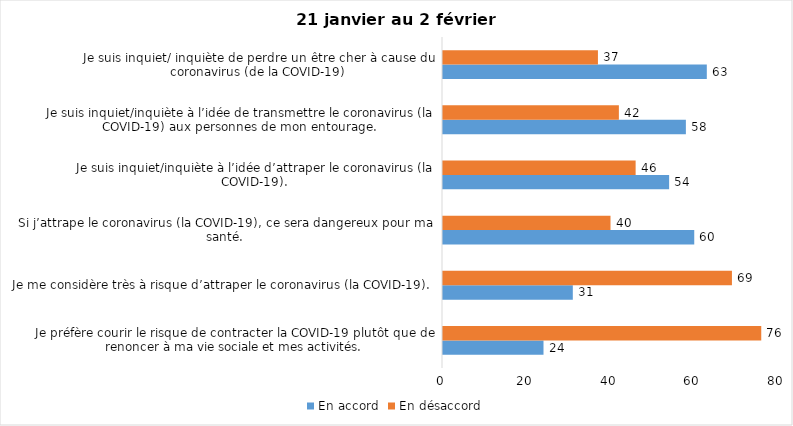
| Category | En accord | En désaccord |
|---|---|---|
| Je préfère courir le risque de contracter la COVID-19 plutôt que de renoncer à ma vie sociale et mes activités. | 24 | 76 |
| Je me considère très à risque d’attraper le coronavirus (la COVID-19). | 31 | 69 |
| Si j’attrape le coronavirus (la COVID-19), ce sera dangereux pour ma santé. | 60 | 40 |
| Je suis inquiet/inquiète à l’idée d’attraper le coronavirus (la COVID-19). | 54 | 46 |
| Je suis inquiet/inquiète à l’idée de transmettre le coronavirus (la COVID-19) aux personnes de mon entourage. | 58 | 42 |
| Je suis inquiet/ inquiète de perdre un être cher à cause du coronavirus (de la COVID-19) | 63 | 37 |